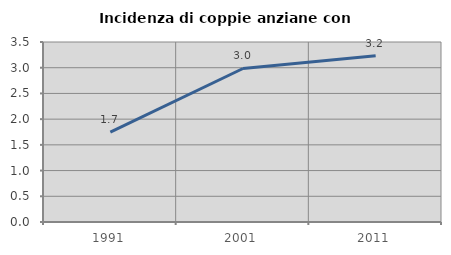
| Category | Incidenza di coppie anziane con figli |
|---|---|
| 1991.0 | 1.749 |
| 2001.0 | 2.985 |
| 2011.0 | 3.232 |